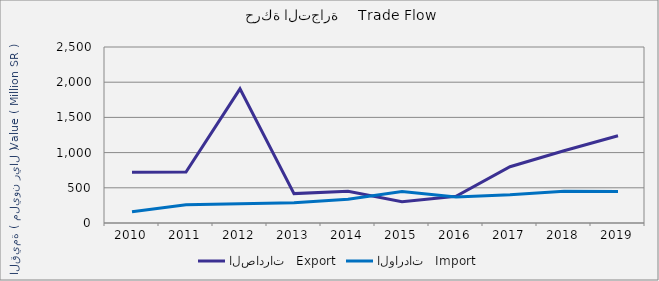
| Category | الصادرات   Export | الواردات   Import |
|---|---|---|
| 2010.0 | 722578304 | 160810446 |
| 2011.0 | 724399999 | 258127494 |
| 2012.0 | 1905732893 | 272074804 |
| 2013.0 | 417641931 | 288727436 |
| 2014.0 | 449869614 | 338146468 |
| 2015.0 | 300764519 | 447392071 |
| 2016.0 | 379541290 | 369224061 |
| 2017.0 | 798861257 | 402092898 |
| 2018.0 | 1025474086 | 452135684 |
| 2019.0 | 1240123288 | 449058745 |